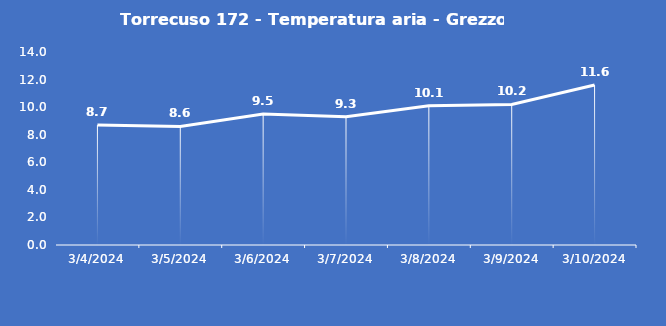
| Category | Torrecuso 172 - Temperatura aria - Grezzo (°C) |
|---|---|
| 3/4/24 | 8.7 |
| 3/5/24 | 8.6 |
| 3/6/24 | 9.5 |
| 3/7/24 | 9.3 |
| 3/8/24 | 10.1 |
| 3/9/24 | 10.2 |
| 3/10/24 | 11.6 |